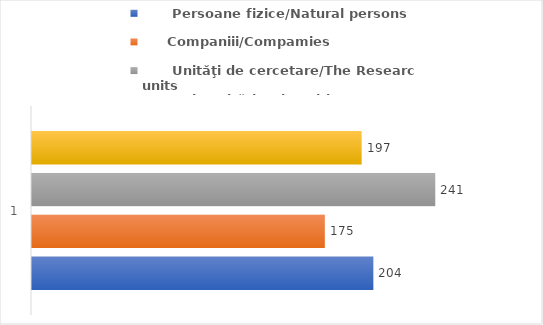
| Category |       Persoane fizice/Natural persons |      Companiii/Compamies |       Unităţi de cercetare/The Research units |       Universităţi/Universities |
|---|---|---|---|---|
| 0 | 204 | 175 | 241 | 197 |